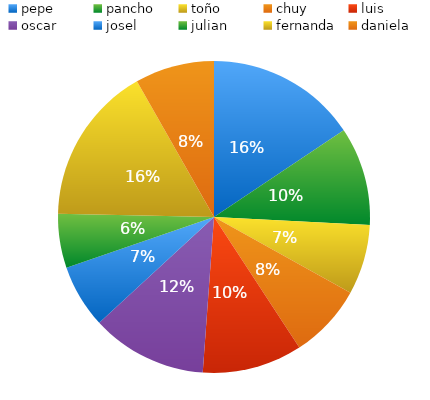
| Category | total |
|---|---|
| pepe | 95 |
| pancho | 62 |
| toño | 44 |
| chuy | 47 |
| luis | 63 |
| oscar | 73 |
| josel | 40 |
| julian | 34 |
| fernanda | 100 |
| daniela | 50 |